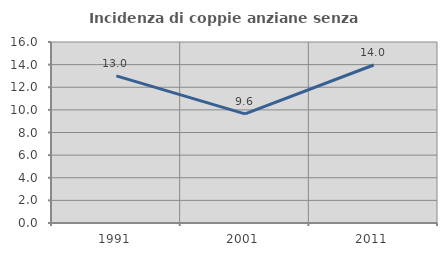
| Category | Incidenza di coppie anziane senza figli  |
|---|---|
| 1991.0 | 13.006 |
| 2001.0 | 9.642 |
| 2011.0 | 13.965 |